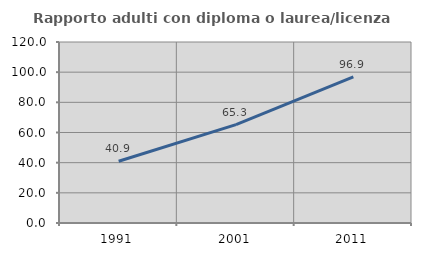
| Category | Rapporto adulti con diploma o laurea/licenza media  |
|---|---|
| 1991.0 | 40.931 |
| 2001.0 | 65.257 |
| 2011.0 | 96.855 |